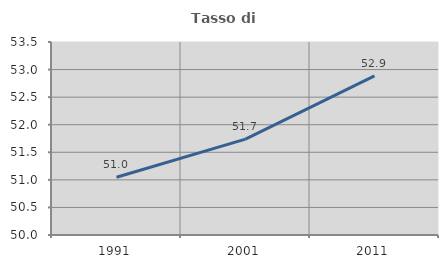
| Category | Tasso di occupazione   |
|---|---|
| 1991.0 | 51.047 |
| 2001.0 | 51.738 |
| 2011.0 | 52.886 |